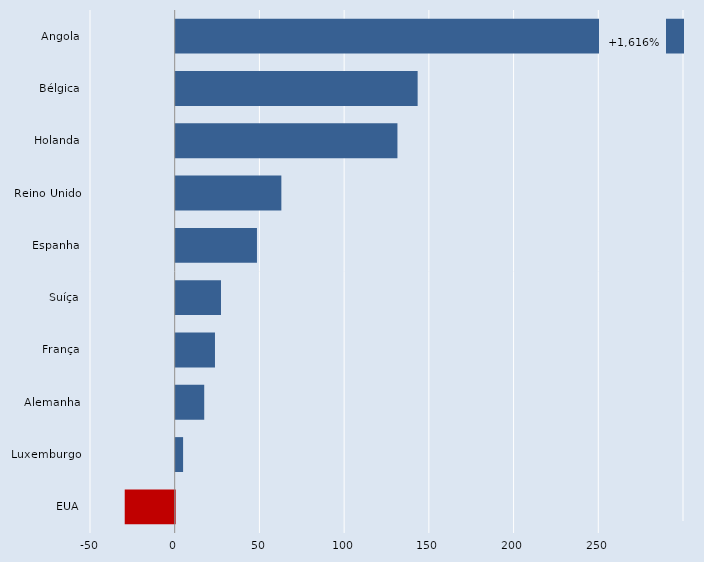
| Category | Series 0 |
|---|---|
| Angola | 300 |
| Bélgica | 142.789 |
| Holanda | 130.865 |
| Reino Unido | 62.352 |
| Espanha | 47.954 |
| Suíça | 26.725 |
| França | 23.174 |
| Alemanha | 16.826 |
| Luxemburgo | 4.356 |
| EUA | -29.505 |